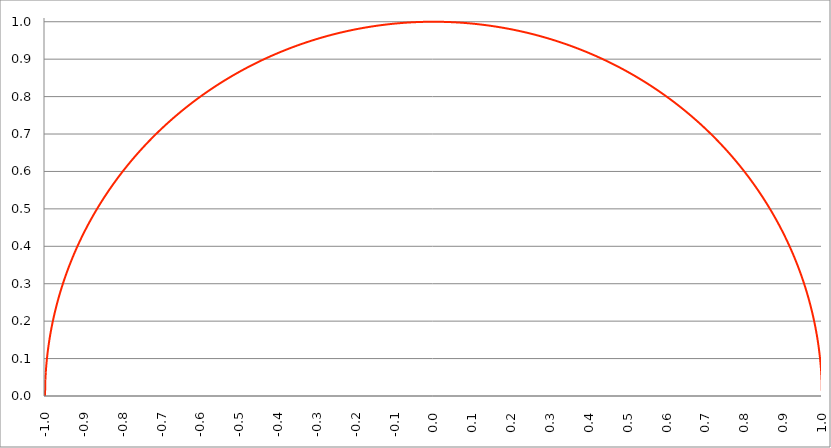
| Category | Series 1 |
|---|---|
| -1.0 | 0 |
| -0.999 | 0.045 |
| -0.998 | 0.063 |
| -0.997 | 0.077 |
| -0.996 | 0.089 |
| -0.995 | 0.1 |
| -0.994 | 0.109 |
| -0.993 | 0.118 |
| -0.992 | 0.126 |
| -0.991 | 0.134 |
| -0.99 | 0.141 |
| -0.989 | 0.148 |
| -0.988 | 0.154 |
| -0.987 | 0.161 |
| -0.986 | 0.167 |
| -0.985 | 0.173 |
| -0.984 | 0.178 |
| -0.983 | 0.184 |
| -0.982 | 0.189 |
| -0.981 | 0.194 |
| -0.98 | 0.199 |
| -0.979 | 0.204 |
| -0.978 | 0.209 |
| -0.977 | 0.213 |
| -0.976 | 0.218 |
| -0.975 | 0.222 |
| -0.974 | 0.227 |
| -0.973 | 0.231 |
| -0.972 | 0.235 |
| -0.971 | 0.239 |
| -0.97 | 0.243 |
| -0.969 | 0.247 |
| -0.968 | 0.251 |
| -0.967 | 0.255 |
| -0.966 | 0.259 |
| -0.965 | 0.262 |
| -0.964 | 0.266 |
| -0.963 | 0.27 |
| -0.962 | 0.273 |
| -0.961 | 0.277 |
| -0.96 | 0.28 |
| -0.959 | 0.283 |
| -0.958 | 0.287 |
| -0.957 | 0.29 |
| -0.956 | 0.293 |
| -0.955 | 0.297 |
| -0.954 | 0.3 |
| -0.953 | 0.303 |
| -0.952 | 0.306 |
| -0.951 | 0.309 |
| -0.95 | 0.312 |
| -0.949 | 0.315 |
| -0.948 | 0.318 |
| -0.947 | 0.321 |
| -0.946 | 0.324 |
| -0.945 | 0.327 |
| -0.944 | 0.33 |
| -0.943 | 0.333 |
| -0.942 | 0.336 |
| -0.941 | 0.338 |
| -0.94 | 0.341 |
| -0.939 | 0.344 |
| -0.938 | 0.347 |
| -0.937 | 0.349 |
| -0.936 | 0.352 |
| -0.935 | 0.355 |
| -0.934 | 0.357 |
| -0.933 | 0.36 |
| -0.932 | 0.362 |
| -0.931 | 0.365 |
| -0.93 | 0.368 |
| -0.929 | 0.37 |
| -0.928 | 0.373 |
| -0.927 | 0.375 |
| -0.926 | 0.378 |
| -0.925 | 0.38 |
| -0.924 | 0.382 |
| -0.923 | 0.385 |
| -0.922 | 0.387 |
| -0.921 | 0.39 |
| -0.92 | 0.392 |
| -0.919 | 0.394 |
| -0.918 | 0.397 |
| -0.917 | 0.399 |
| -0.916 | 0.401 |
| -0.915 | 0.403 |
| -0.914 | 0.406 |
| -0.913 | 0.408 |
| -0.912 | 0.41 |
| -0.911 | 0.412 |
| -0.91 | 0.415 |
| -0.909 | 0.417 |
| -0.908 | 0.419 |
| -0.907 | 0.421 |
| -0.906 | 0.423 |
| -0.905 | 0.425 |
| -0.904 | 0.428 |
| -0.903 | 0.43 |
| -0.902 | 0.432 |
| -0.901 | 0.434 |
| -0.9 | 0.436 |
| -0.899 | 0.438 |
| -0.898 | 0.44 |
| -0.897 | 0.442 |
| -0.896 | 0.444 |
| -0.895 | 0.446 |
| -0.894 | 0.448 |
| -0.893 | 0.45 |
| -0.892 | 0.452 |
| -0.891 | 0.454 |
| -0.89 | 0.456 |
| -0.889 | 0.458 |
| -0.888 | 0.46 |
| -0.887 | 0.462 |
| -0.886 | 0.464 |
| -0.885 | 0.466 |
| -0.884 | 0.467 |
| -0.883 | 0.469 |
| -0.882 | 0.471 |
| -0.881 | 0.473 |
| -0.88 | 0.475 |
| -0.879 | 0.477 |
| -0.878 | 0.479 |
| -0.877 | 0.48 |
| -0.876 | 0.482 |
| -0.875 | 0.484 |
| -0.874 | 0.486 |
| -0.873 | 0.488 |
| -0.872 | 0.49 |
| -0.871 | 0.491 |
| -0.87 | 0.493 |
| -0.869 | 0.495 |
| -0.868 | 0.497 |
| -0.867 | 0.498 |
| -0.866 | 0.5 |
| -0.865 | 0.502 |
| -0.864 | 0.503 |
| -0.863 | 0.505 |
| -0.862 | 0.507 |
| -0.861 | 0.509 |
| -0.86 | 0.51 |
| -0.859 | 0.512 |
| -0.858 | 0.514 |
| -0.857 | 0.515 |
| -0.856 | 0.517 |
| -0.855 | 0.519 |
| -0.854 | 0.52 |
| -0.853 | 0.522 |
| -0.852 | 0.524 |
| -0.851 | 0.525 |
| -0.85 | 0.527 |
| -0.849 | 0.528 |
| -0.848 | 0.53 |
| -0.847 | 0.532 |
| -0.846 | 0.533 |
| -0.845 | 0.535 |
| -0.844 | 0.536 |
| -0.843 | 0.538 |
| -0.842 | 0.539 |
| -0.841 | 0.541 |
| -0.84 | 0.543 |
| -0.839 | 0.544 |
| -0.838 | 0.546 |
| -0.837 | 0.547 |
| -0.836 | 0.549 |
| -0.835 | 0.55 |
| -0.834 | 0.552 |
| -0.833 | 0.553 |
| -0.832 | 0.555 |
| -0.831 | 0.556 |
| -0.83 | 0.558 |
| -0.829 | 0.559 |
| -0.828 | 0.561 |
| -0.827 | 0.562 |
| -0.826 | 0.564 |
| -0.825 | 0.565 |
| -0.824 | 0.567 |
| -0.823 | 0.568 |
| -0.822 | 0.569 |
| -0.821 | 0.571 |
| -0.82 | 0.572 |
| -0.819 | 0.574 |
| -0.818 | 0.575 |
| -0.817 | 0.577 |
| -0.816 | 0.578 |
| -0.815 | 0.579 |
| -0.814 | 0.581 |
| -0.813 | 0.582 |
| -0.812 | 0.584 |
| -0.811 | 0.585 |
| -0.81 | 0.586 |
| -0.809 | 0.588 |
| -0.808 | 0.589 |
| -0.807 | 0.591 |
| -0.806 | 0.592 |
| -0.805 | 0.593 |
| -0.804 | 0.595 |
| -0.803 | 0.596 |
| -0.802 | 0.597 |
| -0.801 | 0.599 |
| -0.8 | 0.6 |
| -0.799 | 0.601 |
| -0.798 | 0.603 |
| -0.797 | 0.604 |
| -0.796 | 0.605 |
| -0.795 | 0.607 |
| -0.794 | 0.608 |
| -0.793 | 0.609 |
| -0.792 | 0.611 |
| -0.791 | 0.612 |
| -0.79 | 0.613 |
| -0.789 | 0.614 |
| -0.788 | 0.616 |
| -0.787 | 0.617 |
| -0.786 | 0.618 |
| -0.785 | 0.619 |
| -0.784 | 0.621 |
| -0.783 | 0.622 |
| -0.782 | 0.623 |
| -0.781 | 0.625 |
| -0.78 | 0.626 |
| -0.779 | 0.627 |
| -0.778 | 0.628 |
| -0.777 | 0.63 |
| -0.776 | 0.631 |
| -0.775 | 0.632 |
| -0.774 | 0.633 |
| -0.773 | 0.634 |
| -0.772 | 0.636 |
| -0.771 | 0.637 |
| -0.77 | 0.638 |
| -0.769 | 0.639 |
| -0.768 | 0.64 |
| -0.767 | 0.642 |
| -0.766 | 0.643 |
| -0.765 | 0.644 |
| -0.764 | 0.645 |
| -0.763 | 0.646 |
| -0.762 | 0.648 |
| -0.761 | 0.649 |
| -0.76 | 0.65 |
| -0.759 | 0.651 |
| -0.758 | 0.652 |
| -0.757 | 0.653 |
| -0.756 | 0.655 |
| -0.755 | 0.656 |
| -0.754 | 0.657 |
| -0.753 | 0.658 |
| -0.752 | 0.659 |
| -0.751 | 0.66 |
| -0.75 | 0.661 |
| -0.749 | 0.663 |
| -0.748 | 0.664 |
| -0.747 | 0.665 |
| -0.746 | 0.666 |
| -0.745 | 0.667 |
| -0.744 | 0.668 |
| -0.743 | 0.669 |
| -0.742 | 0.67 |
| -0.741 | 0.672 |
| -0.74 | 0.673 |
| -0.739 | 0.674 |
| -0.738 | 0.675 |
| -0.737 | 0.676 |
| -0.736 | 0.677 |
| -0.735 | 0.678 |
| -0.734 | 0.679 |
| -0.733 | 0.68 |
| -0.732 | 0.681 |
| -0.731 | 0.682 |
| -0.73 | 0.683 |
| -0.729 | 0.685 |
| -0.728 | 0.686 |
| -0.727 | 0.687 |
| -0.726 | 0.688 |
| -0.725 | 0.689 |
| -0.724 | 0.69 |
| -0.723 | 0.691 |
| -0.722 | 0.692 |
| -0.721 | 0.693 |
| -0.72 | 0.694 |
| -0.719 | 0.695 |
| -0.718 | 0.696 |
| -0.717 | 0.697 |
| -0.716 | 0.698 |
| -0.715 | 0.699 |
| -0.714 | 0.7 |
| -0.713 | 0.701 |
| -0.712 | 0.702 |
| -0.711 | 0.703 |
| -0.71 | 0.704 |
| -0.709 | 0.705 |
| -0.708 | 0.706 |
| -0.707 | 0.707 |
| -0.706 | 0.708 |
| -0.705 | 0.709 |
| -0.704 | 0.71 |
| -0.703 | 0.711 |
| -0.702 | 0.712 |
| -0.701 | 0.713 |
| -0.7 | 0.714 |
| -0.699 | 0.715 |
| -0.698 | 0.716 |
| -0.697 | 0.717 |
| -0.696 | 0.718 |
| -0.695 | 0.719 |
| -0.694 | 0.72 |
| -0.693 | 0.721 |
| -0.692 | 0.722 |
| -0.691 | 0.723 |
| -0.69 | 0.724 |
| -0.689 | 0.725 |
| -0.688 | 0.726 |
| -0.687 | 0.727 |
| -0.686 | 0.728 |
| -0.685 | 0.729 |
| -0.684 | 0.729 |
| -0.683 | 0.73 |
| -0.682 | 0.731 |
| -0.681 | 0.732 |
| -0.68 | 0.733 |
| -0.679 | 0.734 |
| -0.678 | 0.735 |
| -0.677 | 0.736 |
| -0.676 | 0.737 |
| -0.675 | 0.738 |
| -0.674 | 0.739 |
| -0.673 | 0.74 |
| -0.672 | 0.741 |
| -0.671 | 0.741 |
| -0.67 | 0.742 |
| -0.669 | 0.743 |
| -0.668 | 0.744 |
| -0.667 | 0.745 |
| -0.666 | 0.746 |
| -0.665 | 0.747 |
| -0.664 | 0.748 |
| -0.663 | 0.749 |
| -0.662 | 0.75 |
| -0.661 | 0.75 |
| -0.66 | 0.751 |
| -0.659 | 0.752 |
| -0.658 | 0.753 |
| -0.657 | 0.754 |
| -0.656 | 0.755 |
| -0.655 | 0.756 |
| -0.654 | 0.756 |
| -0.653 | 0.757 |
| -0.652 | 0.758 |
| -0.651 | 0.759 |
| -0.65 | 0.76 |
| -0.649 | 0.761 |
| -0.648 | 0.762 |
| -0.647 | 0.762 |
| -0.646 | 0.763 |
| -0.645 | 0.764 |
| -0.644 | 0.765 |
| -0.643 | 0.766 |
| -0.642 | 0.767 |
| -0.641 | 0.768 |
| -0.64 | 0.768 |
| -0.639 | 0.769 |
| -0.638 | 0.77 |
| -0.637 | 0.771 |
| -0.636 | 0.772 |
| -0.635 | 0.773 |
| -0.634 | 0.773 |
| -0.633 | 0.774 |
| -0.632 | 0.775 |
| -0.631 | 0.776 |
| -0.63 | 0.777 |
| -0.629 | 0.777 |
| -0.628 | 0.778 |
| -0.627 | 0.779 |
| -0.626 | 0.78 |
| -0.625 | 0.781 |
| -0.624 | 0.781 |
| -0.623 | 0.782 |
| -0.622 | 0.783 |
| -0.621 | 0.784 |
| -0.62 | 0.785 |
| -0.619 | 0.785 |
| -0.618 | 0.786 |
| -0.617 | 0.787 |
| -0.616 | 0.788 |
| -0.615 | 0.789 |
| -0.614 | 0.789 |
| -0.613 | 0.79 |
| -0.612 | 0.791 |
| -0.611 | 0.792 |
| -0.61 | 0.792 |
| -0.609 | 0.793 |
| -0.608 | 0.794 |
| -0.607 | 0.795 |
| -0.606 | 0.795 |
| -0.605 | 0.796 |
| -0.604 | 0.797 |
| -0.603 | 0.798 |
| -0.602 | 0.798 |
| -0.601 | 0.799 |
| -0.6 | 0.8 |
| -0.599 | 0.801 |
| -0.598 | 0.801 |
| -0.597 | 0.802 |
| -0.596 | 0.803 |
| -0.595 | 0.804 |
| -0.594 | 0.804 |
| -0.593 | 0.805 |
| -0.592 | 0.806 |
| -0.591 | 0.807 |
| -0.59 | 0.807 |
| -0.589 | 0.808 |
| -0.588 | 0.809 |
| -0.587 | 0.81 |
| -0.586 | 0.81 |
| -0.585 | 0.811 |
| -0.584 | 0.812 |
| -0.583 | 0.812 |
| -0.582 | 0.813 |
| -0.581 | 0.814 |
| -0.58 | 0.815 |
| -0.579 | 0.815 |
| -0.578 | 0.816 |
| -0.577 | 0.817 |
| -0.576 | 0.817 |
| -0.575 | 0.818 |
| -0.574 | 0.819 |
| -0.573 | 0.82 |
| -0.572 | 0.82 |
| -0.571 | 0.821 |
| -0.57 | 0.822 |
| -0.569 | 0.822 |
| -0.568 | 0.823 |
| -0.567 | 0.824 |
| -0.566 | 0.824 |
| -0.565 | 0.825 |
| -0.564 | 0.826 |
| -0.563 | 0.826 |
| -0.562 | 0.827 |
| -0.561 | 0.828 |
| -0.56 | 0.828 |
| -0.559 | 0.829 |
| -0.558 | 0.83 |
| -0.557 | 0.831 |
| -0.556 | 0.831 |
| -0.555 | 0.832 |
| -0.554 | 0.833 |
| -0.553 | 0.833 |
| -0.552 | 0.834 |
| -0.551 | 0.835 |
| -0.55 | 0.835 |
| -0.549 | 0.836 |
| -0.548 | 0.836 |
| -0.547 | 0.837 |
| -0.546 | 0.838 |
| -0.545 | 0.838 |
| -0.544 | 0.839 |
| -0.543 | 0.84 |
| -0.542 | 0.84 |
| -0.541 | 0.841 |
| -0.54 | 0.842 |
| -0.539 | 0.842 |
| -0.538 | 0.843 |
| -0.537 | 0.844 |
| -0.536 | 0.844 |
| -0.535 | 0.845 |
| -0.534 | 0.845 |
| -0.533 | 0.846 |
| -0.532 | 0.847 |
| -0.531 | 0.847 |
| -0.53 | 0.848 |
| -0.529 | 0.849 |
| -0.528 | 0.849 |
| -0.527 | 0.85 |
| -0.526 | 0.85 |
| -0.525 | 0.851 |
| -0.524 | 0.852 |
| -0.523 | 0.852 |
| -0.522 | 0.853 |
| -0.521 | 0.854 |
| -0.52 | 0.854 |
| -0.519 | 0.855 |
| -0.518 | 0.855 |
| -0.517 | 0.856 |
| -0.516 | 0.857 |
| -0.515 | 0.857 |
| -0.514 | 0.858 |
| -0.513 | 0.858 |
| -0.512 | 0.859 |
| -0.511 | 0.86 |
| -0.51 | 0.86 |
| -0.509 | 0.861 |
| -0.508 | 0.861 |
| -0.507 | 0.862 |
| -0.506 | 0.863 |
| -0.505 | 0.863 |
| -0.504 | 0.864 |
| -0.503 | 0.864 |
| -0.502 | 0.865 |
| -0.501 | 0.865 |
| -0.5 | 0.866 |
| -0.499 | 0.867 |
| -0.498 | 0.867 |
| -0.497 | 0.868 |
| -0.496 | 0.868 |
| -0.495 | 0.869 |
| -0.494 | 0.869 |
| -0.493 | 0.87 |
| -0.492 | 0.871 |
| -0.491 | 0.871 |
| -0.49 | 0.872 |
| -0.489 | 0.872 |
| -0.488 | 0.873 |
| -0.487 | 0.873 |
| -0.486 | 0.874 |
| -0.485 | 0.875 |
| -0.484 | 0.875 |
| -0.483 | 0.876 |
| -0.482 | 0.876 |
| -0.481 | 0.877 |
| -0.48 | 0.877 |
| -0.479 | 0.878 |
| -0.478 | 0.878 |
| -0.477 | 0.879 |
| -0.476 | 0.879 |
| -0.475 | 0.88 |
| -0.474 | 0.881 |
| -0.473 | 0.881 |
| -0.472 | 0.882 |
| -0.471 | 0.882 |
| -0.469999999999999 | 0.883 |
| -0.468999999999999 | 0.883 |
| -0.467999999999999 | 0.884 |
| -0.466999999999999 | 0.884 |
| -0.465999999999999 | 0.885 |
| -0.464999999999999 | 0.885 |
| -0.463999999999999 | 0.886 |
| -0.462999999999999 | 0.886 |
| -0.461999999999999 | 0.887 |
| -0.460999999999999 | 0.887 |
| -0.459999999999999 | 0.888 |
| -0.458999999999999 | 0.888 |
| -0.457999999999999 | 0.889 |
| -0.456999999999999 | 0.889 |
| -0.455999999999999 | 0.89 |
| -0.454999999999999 | 0.89 |
| -0.453999999999999 | 0.891 |
| -0.452999999999999 | 0.892 |
| -0.451999999999999 | 0.892 |
| -0.450999999999999 | 0.893 |
| -0.449999999999999 | 0.893 |
| -0.448999999999999 | 0.894 |
| -0.447999999999999 | 0.894 |
| -0.446999999999999 | 0.895 |
| -0.445999999999999 | 0.895 |
| -0.444999999999999 | 0.896 |
| -0.443999999999999 | 0.896 |
| -0.442999999999999 | 0.897 |
| -0.441999999999999 | 0.897 |
| -0.440999999999999 | 0.898 |
| -0.439999999999999 | 0.898 |
| -0.438999999999999 | 0.898 |
| -0.437999999999999 | 0.899 |
| -0.436999999999999 | 0.899 |
| -0.435999999999999 | 0.9 |
| -0.434999999999999 | 0.9 |
| -0.433999999999999 | 0.901 |
| -0.432999999999999 | 0.901 |
| -0.431999999999999 | 0.902 |
| -0.430999999999999 | 0.902 |
| -0.429999999999999 | 0.903 |
| -0.428999999999999 | 0.903 |
| -0.427999999999999 | 0.904 |
| -0.426999999999999 | 0.904 |
| -0.425999999999999 | 0.905 |
| -0.424999999999999 | 0.905 |
| -0.423999999999999 | 0.906 |
| -0.422999999999999 | 0.906 |
| -0.421999999999999 | 0.907 |
| -0.420999999999999 | 0.907 |
| -0.419999999999999 | 0.908 |
| -0.418999999999999 | 0.908 |
| -0.417999999999999 | 0.908 |
| -0.416999999999999 | 0.909 |
| -0.415999999999999 | 0.909 |
| -0.414999999999999 | 0.91 |
| -0.413999999999999 | 0.91 |
| -0.412999999999999 | 0.911 |
| -0.411999999999999 | 0.911 |
| -0.410999999999999 | 0.912 |
| -0.409999999999999 | 0.912 |
| -0.408999999999999 | 0.913 |
| -0.407999999999999 | 0.913 |
| -0.406999999999999 | 0.913 |
| -0.405999999999999 | 0.914 |
| -0.404999999999999 | 0.914 |
| -0.403999999999999 | 0.915 |
| -0.402999999999999 | 0.915 |
| -0.401999999999999 | 0.916 |
| -0.400999999999999 | 0.916 |
| -0.399999999999999 | 0.917 |
| -0.398999999999999 | 0.917 |
| -0.397999999999999 | 0.917 |
| -0.396999999999999 | 0.918 |
| -0.395999999999999 | 0.918 |
| -0.394999999999999 | 0.919 |
| -0.393999999999999 | 0.919 |
| -0.392999999999999 | 0.92 |
| -0.391999999999999 | 0.92 |
| -0.390999999999999 | 0.92 |
| -0.389999999999999 | 0.921 |
| -0.388999999999999 | 0.921 |
| -0.387999999999999 | 0.922 |
| -0.386999999999999 | 0.922 |
| -0.385999999999999 | 0.922 |
| -0.384999999999999 | 0.923 |
| -0.383999999999999 | 0.923 |
| -0.382999999999999 | 0.924 |
| -0.381999999999999 | 0.924 |
| -0.380999999999999 | 0.925 |
| -0.379999999999999 | 0.925 |
| -0.378999999999999 | 0.925 |
| -0.377999999999999 | 0.926 |
| -0.376999999999999 | 0.926 |
| -0.375999999999999 | 0.927 |
| -0.374999999999999 | 0.927 |
| -0.373999999999999 | 0.927 |
| -0.372999999999999 | 0.928 |
| -0.371999999999999 | 0.928 |
| -0.370999999999999 | 0.929 |
| -0.369999999999999 | 0.929 |
| -0.368999999999999 | 0.929 |
| -0.367999999999999 | 0.93 |
| -0.366999999999999 | 0.93 |
| -0.365999999999999 | 0.931 |
| -0.364999999999999 | 0.931 |
| -0.363999999999999 | 0.931 |
| -0.362999999999999 | 0.932 |
| -0.361999999999999 | 0.932 |
| -0.360999999999999 | 0.933 |
| -0.359999999999999 | 0.933 |
| -0.358999999999999 | 0.933 |
| -0.357999999999999 | 0.934 |
| -0.356999999999999 | 0.934 |
| -0.355999999999999 | 0.934 |
| -0.354999999999999 | 0.935 |
| -0.353999999999999 | 0.935 |
| -0.352999999999999 | 0.936 |
| -0.351999999999999 | 0.936 |
| -0.350999999999999 | 0.936 |
| -0.349999999999999 | 0.937 |
| -0.348999999999999 | 0.937 |
| -0.347999999999999 | 0.937 |
| -0.346999999999999 | 0.938 |
| -0.345999999999999 | 0.938 |
| -0.344999999999999 | 0.939 |
| -0.343999999999999 | 0.939 |
| -0.342999999999999 | 0.939 |
| -0.341999999999999 | 0.94 |
| -0.340999999999999 | 0.94 |
| -0.339999999999999 | 0.94 |
| -0.338999999999999 | 0.941 |
| -0.337999999999999 | 0.941 |
| -0.336999999999999 | 0.942 |
| -0.335999999999999 | 0.942 |
| -0.334999999999999 | 0.942 |
| -0.333999999999999 | 0.943 |
| -0.332999999999999 | 0.943 |
| -0.331999999999999 | 0.943 |
| -0.330999999999999 | 0.944 |
| -0.329999999999999 | 0.944 |
| -0.328999999999999 | 0.944 |
| -0.327999999999999 | 0.945 |
| -0.326999999999999 | 0.945 |
| -0.325999999999999 | 0.945 |
| -0.324999999999999 | 0.946 |
| -0.323999999999999 | 0.946 |
| -0.322999999999999 | 0.946 |
| -0.321999999999999 | 0.947 |
| -0.320999999999999 | 0.947 |
| -0.319999999999999 | 0.947 |
| -0.318999999999999 | 0.948 |
| -0.317999999999999 | 0.948 |
| -0.316999999999999 | 0.948 |
| -0.315999999999999 | 0.949 |
| -0.314999999999999 | 0.949 |
| -0.313999999999999 | 0.949 |
| -0.312999999999999 | 0.95 |
| -0.311999999999999 | 0.95 |
| -0.310999999999999 | 0.95 |
| -0.309999999999999 | 0.951 |
| -0.308999999999999 | 0.951 |
| -0.307999999999999 | 0.951 |
| -0.306999999999999 | 0.952 |
| -0.305999999999999 | 0.952 |
| -0.304999999999999 | 0.952 |
| -0.303999999999999 | 0.953 |
| -0.302999999999999 | 0.953 |
| -0.301999999999999 | 0.953 |
| -0.300999999999999 | 0.954 |
| -0.299999999999999 | 0.954 |
| -0.298999999999999 | 0.954 |
| -0.297999999999999 | 0.955 |
| -0.296999999999999 | 0.955 |
| -0.295999999999999 | 0.955 |
| -0.294999999999999 | 0.955 |
| -0.293999999999999 | 0.956 |
| -0.292999999999999 | 0.956 |
| -0.291999999999999 | 0.956 |
| -0.290999999999999 | 0.957 |
| -0.289999999999999 | 0.957 |
| -0.288999999999999 | 0.957 |
| -0.287999999999999 | 0.958 |
| -0.286999999999999 | 0.958 |
| -0.285999999999999 | 0.958 |
| -0.284999999999999 | 0.959 |
| -0.283999999999999 | 0.959 |
| -0.282999999999999 | 0.959 |
| -0.281999999999999 | 0.959 |
| -0.280999999999999 | 0.96 |
| -0.279999999999999 | 0.96 |
| -0.278999999999999 | 0.96 |
| -0.277999999999999 | 0.961 |
| -0.276999999999999 | 0.961 |
| -0.275999999999999 | 0.961 |
| -0.274999999999999 | 0.961 |
| -0.273999999999999 | 0.962 |
| -0.272999999999999 | 0.962 |
| -0.271999999999999 | 0.962 |
| -0.270999999999999 | 0.963 |
| -0.269999999999999 | 0.963 |
| -0.268999999999999 | 0.963 |
| -0.267999999999999 | 0.963 |
| -0.266999999999999 | 0.964 |
| -0.265999999999999 | 0.964 |
| -0.264999999999999 | 0.964 |
| -0.263999999999999 | 0.965 |
| -0.262999999999999 | 0.965 |
| -0.261999999999999 | 0.965 |
| -0.260999999999999 | 0.965 |
| -0.259999999999999 | 0.966 |
| -0.258999999999999 | 0.966 |
| -0.257999999999999 | 0.966 |
| -0.256999999999999 | 0.966 |
| -0.255999999999999 | 0.967 |
| -0.254999999999999 | 0.967 |
| -0.253999999999999 | 0.967 |
| -0.252999999999999 | 0.967 |
| -0.251999999999999 | 0.968 |
| -0.250999999999999 | 0.968 |
| -0.249999999999999 | 0.968 |
| -0.248999999999999 | 0.969 |
| -0.247999999999999 | 0.969 |
| -0.246999999999999 | 0.969 |
| -0.245999999999999 | 0.969 |
| -0.244999999999999 | 0.97 |
| -0.243999999999999 | 0.97 |
| -0.242999999999999 | 0.97 |
| -0.241999999999999 | 0.97 |
| -0.240999999999999 | 0.971 |
| -0.239999999999999 | 0.971 |
| -0.238999999999999 | 0.971 |
| -0.237999999999999 | 0.971 |
| -0.236999999999999 | 0.972 |
| -0.235999999999999 | 0.972 |
| -0.234999999999999 | 0.972 |
| -0.233999999999999 | 0.972 |
| -0.232999999999999 | 0.972 |
| -0.231999999999999 | 0.973 |
| -0.230999999999999 | 0.973 |
| -0.229999999999999 | 0.973 |
| -0.228999999999999 | 0.973 |
| -0.227999999999999 | 0.974 |
| -0.226999999999999 | 0.974 |
| -0.225999999999999 | 0.974 |
| -0.224999999999999 | 0.974 |
| -0.223999999999999 | 0.975 |
| -0.222999999999999 | 0.975 |
| -0.221999999999999 | 0.975 |
| -0.220999999999999 | 0.975 |
| -0.219999999999999 | 0.975 |
| -0.218999999999999 | 0.976 |
| -0.217999999999999 | 0.976 |
| -0.216999999999999 | 0.976 |
| -0.215999999999999 | 0.976 |
| -0.214999999999999 | 0.977 |
| -0.213999999999999 | 0.977 |
| -0.212999999999999 | 0.977 |
| -0.211999999999999 | 0.977 |
| -0.210999999999999 | 0.977 |
| -0.209999999999999 | 0.978 |
| -0.208999999999999 | 0.978 |
| -0.207999999999999 | 0.978 |
| -0.206999999999999 | 0.978 |
| -0.205999999999999 | 0.979 |
| -0.204999999999999 | 0.979 |
| -0.203999999999999 | 0.979 |
| -0.202999999999999 | 0.979 |
| -0.201999999999999 | 0.979 |
| -0.200999999999999 | 0.98 |
| -0.199999999999999 | 0.98 |
| -0.198999999999999 | 0.98 |
| -0.197999999999999 | 0.98 |
| -0.196999999999999 | 0.98 |
| -0.195999999999999 | 0.981 |
| -0.194999999999999 | 0.981 |
| -0.193999999999999 | 0.981 |
| -0.192999999999999 | 0.981 |
| -0.191999999999999 | 0.981 |
| -0.190999999999999 | 0.982 |
| -0.189999999999999 | 0.982 |
| -0.188999999999999 | 0.982 |
| -0.187999999999999 | 0.982 |
| -0.186999999999999 | 0.982 |
| -0.185999999999999 | 0.983 |
| -0.184999999999999 | 0.983 |
| -0.183999999999999 | 0.983 |
| -0.182999999999999 | 0.983 |
| -0.181999999999999 | 0.983 |
| -0.180999999999999 | 0.983 |
| -0.179999999999999 | 0.984 |
| -0.178999999999999 | 0.984 |
| -0.177999999999999 | 0.984 |
| -0.176999999999999 | 0.984 |
| -0.175999999999999 | 0.984 |
| -0.174999999999999 | 0.985 |
| -0.173999999999999 | 0.985 |
| -0.172999999999999 | 0.985 |
| -0.171999999999999 | 0.985 |
| -0.170999999999999 | 0.985 |
| -0.169999999999999 | 0.985 |
| -0.168999999999999 | 0.986 |
| -0.167999999999999 | 0.986 |
| -0.166999999999999 | 0.986 |
| -0.165999999999999 | 0.986 |
| -0.164999999999999 | 0.986 |
| -0.163999999999999 | 0.986 |
| -0.162999999999999 | 0.987 |
| -0.161999999999999 | 0.987 |
| -0.160999999999999 | 0.987 |
| -0.159999999999999 | 0.987 |
| -0.158999999999999 | 0.987 |
| -0.157999999999999 | 0.987 |
| -0.156999999999999 | 0.988 |
| -0.155999999999999 | 0.988 |
| -0.154999999999999 | 0.988 |
| -0.153999999999999 | 0.988 |
| -0.152999999999999 | 0.988 |
| -0.151999999999999 | 0.988 |
| -0.150999999999999 | 0.989 |
| -0.149999999999999 | 0.989 |
| -0.148999999999999 | 0.989 |
| -0.147999999999999 | 0.989 |
| -0.146999999999999 | 0.989 |
| -0.145999999999999 | 0.989 |
| -0.144999999999999 | 0.989 |
| -0.143999999999999 | 0.99 |
| -0.142999999999999 | 0.99 |
| -0.141999999999999 | 0.99 |
| -0.140999999999999 | 0.99 |
| -0.139999999999999 | 0.99 |
| -0.138999999999999 | 0.99 |
| -0.137999999999999 | 0.99 |
| -0.136999999999999 | 0.991 |
| -0.135999999999999 | 0.991 |
| -0.134999999999999 | 0.991 |
| -0.133999999999999 | 0.991 |
| -0.132999999999999 | 0.991 |
| -0.131999999999999 | 0.991 |
| -0.130999999999999 | 0.991 |
| -0.129999999999999 | 0.992 |
| -0.128999999999999 | 0.992 |
| -0.127999999999999 | 0.992 |
| -0.126999999999999 | 0.992 |
| -0.125999999999999 | 0.992 |
| -0.124999999999999 | 0.992 |
| -0.123999999999999 | 0.992 |
| -0.122999999999999 | 0.992 |
| -0.121999999999999 | 0.993 |
| -0.120999999999999 | 0.993 |
| -0.119999999999999 | 0.993 |
| -0.118999999999999 | 0.993 |
| -0.117999999999999 | 0.993 |
| -0.116999999999999 | 0.993 |
| -0.115999999999999 | 0.993 |
| -0.114999999999999 | 0.993 |
| -0.113999999999999 | 0.993 |
| -0.112999999999999 | 0.994 |
| -0.111999999999999 | 0.994 |
| -0.110999999999999 | 0.994 |
| -0.109999999999999 | 0.994 |
| -0.108999999999999 | 0.994 |
| -0.107999999999999 | 0.994 |
| -0.106999999999999 | 0.994 |
| -0.105999999999999 | 0.994 |
| -0.104999999999999 | 0.994 |
| -0.103999999999999 | 0.995 |
| -0.102999999999999 | 0.995 |
| -0.101999999999999 | 0.995 |
| -0.100999999999999 | 0.995 |
| -0.0999999999999992 | 0.995 |
| -0.0989999999999992 | 0.995 |
| -0.0979999999999992 | 0.995 |
| -0.0969999999999992 | 0.995 |
| -0.0959999999999992 | 0.995 |
| -0.0949999999999992 | 0.995 |
| -0.0939999999999992 | 0.996 |
| -0.0929999999999992 | 0.996 |
| -0.0919999999999992 | 0.996 |
| -0.0909999999999992 | 0.996 |
| -0.0899999999999992 | 0.996 |
| -0.0889999999999992 | 0.996 |
| -0.0879999999999992 | 0.996 |
| -0.0869999999999992 | 0.996 |
| -0.0859999999999992 | 0.996 |
| -0.0849999999999992 | 0.996 |
| -0.0839999999999992 | 0.996 |
| -0.0829999999999992 | 0.997 |
| -0.0819999999999992 | 0.997 |
| -0.0809999999999992 | 0.997 |
| -0.0799999999999992 | 0.997 |
| -0.0789999999999992 | 0.997 |
| -0.0779999999999992 | 0.997 |
| -0.0769999999999992 | 0.997 |
| -0.0759999999999992 | 0.997 |
| -0.0749999999999992 | 0.997 |
| -0.0739999999999992 | 0.997 |
| -0.0729999999999992 | 0.997 |
| -0.0719999999999992 | 0.997 |
| -0.0709999999999992 | 0.997 |
| -0.0699999999999992 | 0.998 |
| -0.0689999999999992 | 0.998 |
| -0.0679999999999992 | 0.998 |
| -0.0669999999999992 | 0.998 |
| -0.0659999999999992 | 0.998 |
| -0.0649999999999992 | 0.998 |
| -0.0639999999999992 | 0.998 |
| -0.0629999999999992 | 0.998 |
| -0.0619999999999992 | 0.998 |
| -0.0609999999999992 | 0.998 |
| -0.0599999999999992 | 0.998 |
| -0.0589999999999992 | 0.998 |
| -0.0579999999999992 | 0.998 |
| -0.0569999999999992 | 0.998 |
| -0.0559999999999992 | 0.998 |
| -0.0549999999999991 | 0.998 |
| -0.0539999999999991 | 0.999 |
| -0.0529999999999991 | 0.999 |
| -0.0519999999999991 | 0.999 |
| -0.0509999999999991 | 0.999 |
| -0.0499999999999991 | 0.999 |
| -0.0489999999999991 | 0.999 |
| -0.0479999999999991 | 0.999 |
| -0.0469999999999991 | 0.999 |
| -0.0459999999999991 | 0.999 |
| -0.0449999999999991 | 0.999 |
| -0.0439999999999991 | 0.999 |
| -0.0429999999999991 | 0.999 |
| -0.0419999999999991 | 0.999 |
| -0.0409999999999991 | 0.999 |
| -0.0399999999999991 | 0.999 |
| -0.0389999999999991 | 0.999 |
| -0.0379999999999991 | 0.999 |
| -0.0369999999999991 | 0.999 |
| -0.0359999999999991 | 0.999 |
| -0.0349999999999991 | 0.999 |
| -0.0339999999999991 | 0.999 |
| -0.0329999999999991 | 0.999 |
| -0.0319999999999991 | 0.999 |
| -0.0309999999999991 | 1 |
| -0.0299999999999991 | 1 |
| -0.0289999999999991 | 1 |
| -0.0279999999999991 | 1 |
| -0.0269999999999991 | 1 |
| -0.0259999999999991 | 1 |
| -0.0249999999999991 | 1 |
| -0.0239999999999991 | 1 |
| -0.0229999999999991 | 1 |
| -0.0219999999999991 | 1 |
| -0.0209999999999991 | 1 |
| -0.0199999999999991 | 1 |
| -0.0189999999999991 | 1 |
| -0.0179999999999991 | 1 |
| -0.0169999999999991 | 1 |
| -0.0159999999999991 | 1 |
| -0.0149999999999991 | 1 |
| -0.0139999999999991 | 1 |
| -0.0129999999999991 | 1 |
| -0.0119999999999991 | 1 |
| -0.0109999999999991 | 1 |
| -0.00999999999999912 | 1 |
| -0.00899999999999912 | 1 |
| -0.00799999999999912 | 1 |
| -0.00699999999999912 | 1 |
| -0.00599999999999912 | 1 |
| -0.00499999999999912 | 1 |
| -0.00399999999999912 | 1 |
| -0.00299999999999912 | 1 |
| -0.00199999999999912 | 1 |
| -0.000999999999999118 | 1 |
| 8.81239525796218e-16 | 1 |
| 0.00100000000000088 | 1 |
| 0.00200000000000088 | 1 |
| 0.00300000000000088 | 1 |
| 0.00400000000000088 | 1 |
| 0.00500000000000088 | 1 |
| 0.00600000000000088 | 1 |
| 0.00700000000000088 | 1 |
| 0.00800000000000088 | 1 |
| 0.00900000000000088 | 1 |
| 0.0100000000000009 | 1 |
| 0.0110000000000009 | 1 |
| 0.0120000000000009 | 1 |
| 0.0130000000000009 | 1 |
| 0.0140000000000009 | 1 |
| 0.0150000000000009 | 1 |
| 0.0160000000000009 | 1 |
| 0.0170000000000009 | 1 |
| 0.0180000000000009 | 1 |
| 0.0190000000000009 | 1 |
| 0.0200000000000009 | 1 |
| 0.0210000000000009 | 1 |
| 0.0220000000000009 | 1 |
| 0.0230000000000009 | 1 |
| 0.0240000000000009 | 1 |
| 0.0250000000000009 | 1 |
| 0.0260000000000009 | 1 |
| 0.0270000000000009 | 1 |
| 0.0280000000000009 | 1 |
| 0.0290000000000009 | 1 |
| 0.0300000000000009 | 1 |
| 0.0310000000000009 | 1 |
| 0.0320000000000009 | 0.999 |
| 0.0330000000000009 | 0.999 |
| 0.0340000000000009 | 0.999 |
| 0.0350000000000009 | 0.999 |
| 0.0360000000000009 | 0.999 |
| 0.0370000000000009 | 0.999 |
| 0.0380000000000009 | 0.999 |
| 0.0390000000000009 | 0.999 |
| 0.0400000000000009 | 0.999 |
| 0.0410000000000009 | 0.999 |
| 0.0420000000000009 | 0.999 |
| 0.0430000000000009 | 0.999 |
| 0.0440000000000009 | 0.999 |
| 0.0450000000000009 | 0.999 |
| 0.0460000000000009 | 0.999 |
| 0.0470000000000009 | 0.999 |
| 0.0480000000000009 | 0.999 |
| 0.0490000000000009 | 0.999 |
| 0.0500000000000009 | 0.999 |
| 0.0510000000000009 | 0.999 |
| 0.0520000000000009 | 0.999 |
| 0.0530000000000009 | 0.999 |
| 0.0540000000000009 | 0.999 |
| 0.0550000000000009 | 0.998 |
| 0.0560000000000009 | 0.998 |
| 0.0570000000000009 | 0.998 |
| 0.0580000000000009 | 0.998 |
| 0.0590000000000009 | 0.998 |
| 0.0600000000000009 | 0.998 |
| 0.0610000000000009 | 0.998 |
| 0.0620000000000009 | 0.998 |
| 0.0630000000000009 | 0.998 |
| 0.0640000000000009 | 0.998 |
| 0.0650000000000009 | 0.998 |
| 0.0660000000000009 | 0.998 |
| 0.0670000000000009 | 0.998 |
| 0.0680000000000009 | 0.998 |
| 0.0690000000000009 | 0.998 |
| 0.0700000000000009 | 0.998 |
| 0.0710000000000009 | 0.997 |
| 0.0720000000000009 | 0.997 |
| 0.0730000000000009 | 0.997 |
| 0.0740000000000009 | 0.997 |
| 0.0750000000000009 | 0.997 |
| 0.0760000000000009 | 0.997 |
| 0.0770000000000009 | 0.997 |
| 0.0780000000000009 | 0.997 |
| 0.0790000000000009 | 0.997 |
| 0.0800000000000009 | 0.997 |
| 0.0810000000000009 | 0.997 |
| 0.0820000000000009 | 0.997 |
| 0.0830000000000009 | 0.997 |
| 0.0840000000000009 | 0.996 |
| 0.0850000000000009 | 0.996 |
| 0.0860000000000009 | 0.996 |
| 0.0870000000000009 | 0.996 |
| 0.0880000000000009 | 0.996 |
| 0.0890000000000009 | 0.996 |
| 0.0900000000000009 | 0.996 |
| 0.0910000000000009 | 0.996 |
| 0.0920000000000009 | 0.996 |
| 0.0930000000000009 | 0.996 |
| 0.0940000000000009 | 0.996 |
| 0.0950000000000009 | 0.995 |
| 0.0960000000000009 | 0.995 |
| 0.0970000000000009 | 0.995 |
| 0.0980000000000009 | 0.995 |
| 0.0990000000000009 | 0.995 |
| 0.100000000000001 | 0.995 |
| 0.101000000000001 | 0.995 |
| 0.102000000000001 | 0.995 |
| 0.103000000000001 | 0.995 |
| 0.104000000000001 | 0.995 |
| 0.105000000000001 | 0.994 |
| 0.106000000000001 | 0.994 |
| 0.107000000000001 | 0.994 |
| 0.108000000000001 | 0.994 |
| 0.109000000000001 | 0.994 |
| 0.110000000000001 | 0.994 |
| 0.111000000000001 | 0.994 |
| 0.112000000000001 | 0.994 |
| 0.113000000000001 | 0.994 |
| 0.114000000000001 | 0.993 |
| 0.115000000000001 | 0.993 |
| 0.116000000000001 | 0.993 |
| 0.117000000000001 | 0.993 |
| 0.118000000000001 | 0.993 |
| 0.119000000000001 | 0.993 |
| 0.120000000000001 | 0.993 |
| 0.121000000000001 | 0.993 |
| 0.122000000000001 | 0.993 |
| 0.123000000000001 | 0.992 |
| 0.124000000000001 | 0.992 |
| 0.125000000000001 | 0.992 |
| 0.126000000000001 | 0.992 |
| 0.127000000000001 | 0.992 |
| 0.128000000000001 | 0.992 |
| 0.129000000000001 | 0.992 |
| 0.130000000000001 | 0.992 |
| 0.131000000000001 | 0.991 |
| 0.132000000000001 | 0.991 |
| 0.133000000000001 | 0.991 |
| 0.134000000000001 | 0.991 |
| 0.135000000000001 | 0.991 |
| 0.136000000000001 | 0.991 |
| 0.137000000000001 | 0.991 |
| 0.138000000000001 | 0.99 |
| 0.139000000000001 | 0.99 |
| 0.140000000000001 | 0.99 |
| 0.141000000000001 | 0.99 |
| 0.142000000000001 | 0.99 |
| 0.143000000000001 | 0.99 |
| 0.144000000000001 | 0.99 |
| 0.145000000000001 | 0.989 |
| 0.146000000000001 | 0.989 |
| 0.147000000000001 | 0.989 |
| 0.148000000000001 | 0.989 |
| 0.149000000000001 | 0.989 |
| 0.150000000000001 | 0.989 |
| 0.151000000000001 | 0.989 |
| 0.152000000000001 | 0.988 |
| 0.153000000000001 | 0.988 |
| 0.154000000000001 | 0.988 |
| 0.155000000000001 | 0.988 |
| 0.156000000000001 | 0.988 |
| 0.157000000000001 | 0.988 |
| 0.158000000000001 | 0.987 |
| 0.159000000000001 | 0.987 |
| 0.160000000000001 | 0.987 |
| 0.161000000000001 | 0.987 |
| 0.162000000000001 | 0.987 |
| 0.163000000000001 | 0.987 |
| 0.164000000000001 | 0.986 |
| 0.165000000000001 | 0.986 |
| 0.166000000000001 | 0.986 |
| 0.167000000000001 | 0.986 |
| 0.168000000000001 | 0.986 |
| 0.169000000000001 | 0.986 |
| 0.170000000000001 | 0.985 |
| 0.171000000000001 | 0.985 |
| 0.172000000000001 | 0.985 |
| 0.173000000000001 | 0.985 |
| 0.174000000000001 | 0.985 |
| 0.175000000000001 | 0.985 |
| 0.176000000000001 | 0.984 |
| 0.177000000000001 | 0.984 |
| 0.178000000000001 | 0.984 |
| 0.179000000000001 | 0.984 |
| 0.180000000000001 | 0.984 |
| 0.181000000000001 | 0.983 |
| 0.182000000000001 | 0.983 |
| 0.183000000000001 | 0.983 |
| 0.184000000000001 | 0.983 |
| 0.185000000000001 | 0.983 |
| 0.186000000000001 | 0.983 |
| 0.187000000000001 | 0.982 |
| 0.188000000000001 | 0.982 |
| 0.189000000000001 | 0.982 |
| 0.190000000000001 | 0.982 |
| 0.191000000000001 | 0.982 |
| 0.192000000000001 | 0.981 |
| 0.193000000000001 | 0.981 |
| 0.194000000000001 | 0.981 |
| 0.195000000000001 | 0.981 |
| 0.196000000000001 | 0.981 |
| 0.197000000000001 | 0.98 |
| 0.198000000000001 | 0.98 |
| 0.199000000000001 | 0.98 |
| 0.200000000000001 | 0.98 |
| 0.201000000000001 | 0.98 |
| 0.202000000000001 | 0.979 |
| 0.203000000000001 | 0.979 |
| 0.204000000000001 | 0.979 |
| 0.205000000000001 | 0.979 |
| 0.206000000000001 | 0.979 |
| 0.207000000000001 | 0.978 |
| 0.208000000000001 | 0.978 |
| 0.209000000000001 | 0.978 |
| 0.210000000000001 | 0.978 |
| 0.211000000000001 | 0.977 |
| 0.212000000000001 | 0.977 |
| 0.213000000000001 | 0.977 |
| 0.214000000000001 | 0.977 |
| 0.215000000000001 | 0.977 |
| 0.216000000000001 | 0.976 |
| 0.217000000000001 | 0.976 |
| 0.218000000000001 | 0.976 |
| 0.219000000000001 | 0.976 |
| 0.220000000000001 | 0.975 |
| 0.221000000000001 | 0.975 |
| 0.222000000000001 | 0.975 |
| 0.223000000000001 | 0.975 |
| 0.224000000000001 | 0.975 |
| 0.225000000000001 | 0.974 |
| 0.226000000000001 | 0.974 |
| 0.227000000000001 | 0.974 |
| 0.228000000000001 | 0.974 |
| 0.229000000000001 | 0.973 |
| 0.230000000000001 | 0.973 |
| 0.231000000000001 | 0.973 |
| 0.232000000000001 | 0.973 |
| 0.233000000000001 | 0.972 |
| 0.234000000000001 | 0.972 |
| 0.235000000000001 | 0.972 |
| 0.236000000000001 | 0.972 |
| 0.237000000000001 | 0.972 |
| 0.238000000000001 | 0.971 |
| 0.239000000000001 | 0.971 |
| 0.240000000000001 | 0.971 |
| 0.241000000000001 | 0.971 |
| 0.242000000000001 | 0.97 |
| 0.243000000000001 | 0.97 |
| 0.244000000000001 | 0.97 |
| 0.245000000000001 | 0.97 |
| 0.246000000000001 | 0.969 |
| 0.247000000000001 | 0.969 |
| 0.248000000000001 | 0.969 |
| 0.249000000000001 | 0.969 |
| 0.250000000000001 | 0.968 |
| 0.251000000000001 | 0.968 |
| 0.252000000000001 | 0.968 |
| 0.253000000000001 | 0.967 |
| 0.254000000000001 | 0.967 |
| 0.255000000000001 | 0.967 |
| 0.256000000000001 | 0.967 |
| 0.257000000000001 | 0.966 |
| 0.258000000000001 | 0.966 |
| 0.259000000000001 | 0.966 |
| 0.260000000000001 | 0.966 |
| 0.261000000000001 | 0.965 |
| 0.262000000000001 | 0.965 |
| 0.263000000000001 | 0.965 |
| 0.264000000000001 | 0.965 |
| 0.265000000000001 | 0.964 |
| 0.266000000000001 | 0.964 |
| 0.267000000000001 | 0.964 |
| 0.268000000000001 | 0.963 |
| 0.269000000000001 | 0.963 |
| 0.270000000000001 | 0.963 |
| 0.271000000000001 | 0.963 |
| 0.272000000000001 | 0.962 |
| 0.273000000000001 | 0.962 |
| 0.274000000000001 | 0.962 |
| 0.275000000000001 | 0.961 |
| 0.276000000000001 | 0.961 |
| 0.277000000000001 | 0.961 |
| 0.278000000000001 | 0.961 |
| 0.279000000000001 | 0.96 |
| 0.280000000000001 | 0.96 |
| 0.281000000000001 | 0.96 |
| 0.282000000000001 | 0.959 |
| 0.283000000000001 | 0.959 |
| 0.284000000000001 | 0.959 |
| 0.285000000000001 | 0.959 |
| 0.286000000000001 | 0.958 |
| 0.287000000000001 | 0.958 |
| 0.288000000000001 | 0.958 |
| 0.289000000000001 | 0.957 |
| 0.290000000000001 | 0.957 |
| 0.291000000000001 | 0.957 |
| 0.292000000000001 | 0.956 |
| 0.293000000000001 | 0.956 |
| 0.294000000000001 | 0.956 |
| 0.295000000000001 | 0.955 |
| 0.296000000000001 | 0.955 |
| 0.297000000000001 | 0.955 |
| 0.298000000000001 | 0.955 |
| 0.299000000000001 | 0.954 |
| 0.300000000000001 | 0.954 |
| 0.301000000000001 | 0.954 |
| 0.302000000000001 | 0.953 |
| 0.303000000000001 | 0.953 |
| 0.304000000000001 | 0.953 |
| 0.305000000000001 | 0.952 |
| 0.306000000000001 | 0.952 |
| 0.307000000000001 | 0.952 |
| 0.308000000000001 | 0.951 |
| 0.309000000000001 | 0.951 |
| 0.310000000000001 | 0.951 |
| 0.311000000000001 | 0.95 |
| 0.312000000000001 | 0.95 |
| 0.313000000000001 | 0.95 |
| 0.314000000000001 | 0.949 |
| 0.315000000000001 | 0.949 |
| 0.316000000000001 | 0.949 |
| 0.317000000000001 | 0.948 |
| 0.318000000000001 | 0.948 |
| 0.319000000000001 | 0.948 |
| 0.320000000000001 | 0.947 |
| 0.321000000000001 | 0.947 |
| 0.322000000000001 | 0.947 |
| 0.323000000000001 | 0.946 |
| 0.324000000000001 | 0.946 |
| 0.325000000000001 | 0.946 |
| 0.326000000000001 | 0.945 |
| 0.327000000000001 | 0.945 |
| 0.328000000000001 | 0.945 |
| 0.329000000000001 | 0.944 |
| 0.330000000000001 | 0.944 |
| 0.331000000000001 | 0.944 |
| 0.332000000000001 | 0.943 |
| 0.333000000000001 | 0.943 |
| 0.334000000000001 | 0.943 |
| 0.335000000000001 | 0.942 |
| 0.336000000000001 | 0.942 |
| 0.337000000000001 | 0.942 |
| 0.338000000000001 | 0.941 |
| 0.339000000000001 | 0.941 |
| 0.340000000000001 | 0.94 |
| 0.341000000000001 | 0.94 |
| 0.342000000000001 | 0.94 |
| 0.343000000000001 | 0.939 |
| 0.344000000000001 | 0.939 |
| 0.345000000000001 | 0.939 |
| 0.346000000000001 | 0.938 |
| 0.347000000000001 | 0.938 |
| 0.348000000000001 | 0.937 |
| 0.349000000000001 | 0.937 |
| 0.350000000000001 | 0.937 |
| 0.351000000000001 | 0.936 |
| 0.352000000000001 | 0.936 |
| 0.353000000000001 | 0.936 |
| 0.354000000000001 | 0.935 |
| 0.355000000000001 | 0.935 |
| 0.356000000000001 | 0.934 |
| 0.357000000000001 | 0.934 |
| 0.358000000000001 | 0.934 |
| 0.359000000000001 | 0.933 |
| 0.360000000000001 | 0.933 |
| 0.361000000000001 | 0.933 |
| 0.362000000000001 | 0.932 |
| 0.363000000000001 | 0.932 |
| 0.364000000000001 | 0.931 |
| 0.365000000000001 | 0.931 |
| 0.366000000000001 | 0.931 |
| 0.367000000000001 | 0.93 |
| 0.368000000000001 | 0.93 |
| 0.369000000000001 | 0.929 |
| 0.370000000000001 | 0.929 |
| 0.371000000000001 | 0.929 |
| 0.372000000000001 | 0.928 |
| 0.373000000000001 | 0.928 |
| 0.374000000000001 | 0.927 |
| 0.375000000000001 | 0.927 |
| 0.376000000000001 | 0.927 |
| 0.377000000000001 | 0.926 |
| 0.378000000000001 | 0.926 |
| 0.379000000000001 | 0.925 |
| 0.380000000000001 | 0.925 |
| 0.381000000000001 | 0.925 |
| 0.382000000000001 | 0.924 |
| 0.383000000000001 | 0.924 |
| 0.384000000000001 | 0.923 |
| 0.385000000000001 | 0.923 |
| 0.386000000000001 | 0.922 |
| 0.387000000000001 | 0.922 |
| 0.388000000000001 | 0.922 |
| 0.389000000000001 | 0.921 |
| 0.390000000000001 | 0.921 |
| 0.391000000000001 | 0.92 |
| 0.392000000000001 | 0.92 |
| 0.393000000000001 | 0.92 |
| 0.394000000000001 | 0.919 |
| 0.395000000000001 | 0.919 |
| 0.396000000000001 | 0.918 |
| 0.397000000000001 | 0.918 |
| 0.398000000000001 | 0.917 |
| 0.399000000000001 | 0.917 |
| 0.400000000000001 | 0.917 |
| 0.401000000000001 | 0.916 |
| 0.402000000000001 | 0.916 |
| 0.403000000000001 | 0.915 |
| 0.404000000000001 | 0.915 |
| 0.405000000000001 | 0.914 |
| 0.406000000000001 | 0.914 |
| 0.407000000000001 | 0.913 |
| 0.408000000000001 | 0.913 |
| 0.409000000000001 | 0.913 |
| 0.410000000000001 | 0.912 |
| 0.411000000000001 | 0.912 |
| 0.412000000000001 | 0.911 |
| 0.413000000000001 | 0.911 |
| 0.414000000000001 | 0.91 |
| 0.415000000000001 | 0.91 |
| 0.416000000000001 | 0.909 |
| 0.417000000000001 | 0.909 |
| 0.418000000000001 | 0.908 |
| 0.419000000000001 | 0.908 |
| 0.420000000000001 | 0.908 |
| 0.421000000000001 | 0.907 |
| 0.422000000000001 | 0.907 |
| 0.423000000000001 | 0.906 |
| 0.424000000000001 | 0.906 |
| 0.425000000000001 | 0.905 |
| 0.426000000000001 | 0.905 |
| 0.427000000000001 | 0.904 |
| 0.428000000000001 | 0.904 |
| 0.429000000000001 | 0.903 |
| 0.430000000000001 | 0.903 |
| 0.431000000000001 | 0.902 |
| 0.432000000000001 | 0.902 |
| 0.433000000000001 | 0.901 |
| 0.434000000000001 | 0.901 |
| 0.435000000000001 | 0.9 |
| 0.436000000000001 | 0.9 |
| 0.437000000000001 | 0.899 |
| 0.438000000000001 | 0.899 |
| 0.439000000000001 | 0.898 |
| 0.440000000000001 | 0.898 |
| 0.441000000000001 | 0.898 |
| 0.442000000000001 | 0.897 |
| 0.443000000000001 | 0.897 |
| 0.444000000000001 | 0.896 |
| 0.445000000000001 | 0.896 |
| 0.446000000000001 | 0.895 |
| 0.447000000000001 | 0.895 |
| 0.448000000000001 | 0.894 |
| 0.449000000000001 | 0.894 |
| 0.450000000000001 | 0.893 |
| 0.451000000000001 | 0.893 |
| 0.452000000000001 | 0.892 |
| 0.453000000000001 | 0.892 |
| 0.454000000000001 | 0.891 |
| 0.455000000000001 | 0.89 |
| 0.456000000000001 | 0.89 |
| 0.457000000000001 | 0.889 |
| 0.458000000000001 | 0.889 |
| 0.459000000000001 | 0.888 |
| 0.460000000000001 | 0.888 |
| 0.461000000000001 | 0.887 |
| 0.462000000000001 | 0.887 |
| 0.463000000000001 | 0.886 |
| 0.464000000000001 | 0.886 |
| 0.465000000000001 | 0.885 |
| 0.466000000000001 | 0.885 |
| 0.467000000000001 | 0.884 |
| 0.468000000000001 | 0.884 |
| 0.469000000000001 | 0.883 |
| 0.470000000000001 | 0.883 |
| 0.471000000000001 | 0.882 |
| 0.472000000000001 | 0.882 |
| 0.473000000000001 | 0.881 |
| 0.474000000000001 | 0.881 |
| 0.475000000000001 | 0.88 |
| 0.476000000000001 | 0.879 |
| 0.477000000000001 | 0.879 |
| 0.478000000000001 | 0.878 |
| 0.479000000000001 | 0.878 |
| 0.480000000000001 | 0.877 |
| 0.481000000000001 | 0.877 |
| 0.482000000000001 | 0.876 |
| 0.483000000000001 | 0.876 |
| 0.484000000000001 | 0.875 |
| 0.485000000000001 | 0.875 |
| 0.486000000000001 | 0.874 |
| 0.487000000000001 | 0.873 |
| 0.488000000000001 | 0.873 |
| 0.489000000000001 | 0.872 |
| 0.490000000000001 | 0.872 |
| 0.491000000000001 | 0.871 |
| 0.492000000000001 | 0.871 |
| 0.493000000000001 | 0.87 |
| 0.494000000000001 | 0.869 |
| 0.495000000000001 | 0.869 |
| 0.496000000000001 | 0.868 |
| 0.497000000000001 | 0.868 |
| 0.498000000000001 | 0.867 |
| 0.499000000000001 | 0.867 |
| 0.500000000000001 | 0.866 |
| 0.501000000000001 | 0.865 |
| 0.502000000000001 | 0.865 |
| 0.503000000000001 | 0.864 |
| 0.504000000000001 | 0.864 |
| 0.505000000000001 | 0.863 |
| 0.506000000000001 | 0.863 |
| 0.507000000000001 | 0.862 |
| 0.508000000000001 | 0.861 |
| 0.509000000000001 | 0.861 |
| 0.510000000000001 | 0.86 |
| 0.511000000000001 | 0.86 |
| 0.512000000000001 | 0.859 |
| 0.513000000000001 | 0.858 |
| 0.514000000000001 | 0.858 |
| 0.515000000000001 | 0.857 |
| 0.516000000000001 | 0.857 |
| 0.517000000000001 | 0.856 |
| 0.518000000000001 | 0.855 |
| 0.519000000000001 | 0.855 |
| 0.520000000000001 | 0.854 |
| 0.521000000000001 | 0.854 |
| 0.522000000000001 | 0.853 |
| 0.523000000000001 | 0.852 |
| 0.524000000000001 | 0.852 |
| 0.525000000000001 | 0.851 |
| 0.526000000000001 | 0.85 |
| 0.527000000000001 | 0.85 |
| 0.528000000000001 | 0.849 |
| 0.529000000000001 | 0.849 |
| 0.530000000000001 | 0.848 |
| 0.531000000000001 | 0.847 |
| 0.532000000000001 | 0.847 |
| 0.533000000000001 | 0.846 |
| 0.534000000000001 | 0.845 |
| 0.535000000000001 | 0.845 |
| 0.536000000000001 | 0.844 |
| 0.537000000000001 | 0.844 |
| 0.538000000000001 | 0.843 |
| 0.539000000000001 | 0.842 |
| 0.540000000000001 | 0.842 |
| 0.541000000000001 | 0.841 |
| 0.542000000000001 | 0.84 |
| 0.543000000000001 | 0.84 |
| 0.544000000000001 | 0.839 |
| 0.545000000000001 | 0.838 |
| 0.546000000000001 | 0.838 |
| 0.547000000000001 | 0.837 |
| 0.548000000000001 | 0.836 |
| 0.549000000000001 | 0.836 |
| 0.550000000000001 | 0.835 |
| 0.551000000000001 | 0.835 |
| 0.552000000000001 | 0.834 |
| 0.553000000000001 | 0.833 |
| 0.554000000000001 | 0.833 |
| 0.555000000000001 | 0.832 |
| 0.556000000000001 | 0.831 |
| 0.557000000000001 | 0.831 |
| 0.558000000000001 | 0.83 |
| 0.559000000000001 | 0.829 |
| 0.560000000000001 | 0.828 |
| 0.561000000000001 | 0.828 |
| 0.562000000000001 | 0.827 |
| 0.563000000000001 | 0.826 |
| 0.564000000000001 | 0.826 |
| 0.565000000000001 | 0.825 |
| 0.566000000000001 | 0.824 |
| 0.567000000000001 | 0.824 |
| 0.568000000000001 | 0.823 |
| 0.569000000000001 | 0.822 |
| 0.570000000000001 | 0.822 |
| 0.571000000000001 | 0.821 |
| 0.572000000000001 | 0.82 |
| 0.573000000000001 | 0.82 |
| 0.574000000000001 | 0.819 |
| 0.575000000000001 | 0.818 |
| 0.576000000000001 | 0.817 |
| 0.577000000000001 | 0.817 |
| 0.578000000000001 | 0.816 |
| 0.579000000000001 | 0.815 |
| 0.580000000000001 | 0.815 |
| 0.581000000000001 | 0.814 |
| 0.582000000000001 | 0.813 |
| 0.583000000000001 | 0.812 |
| 0.584000000000001 | 0.812 |
| 0.585000000000001 | 0.811 |
| 0.586000000000001 | 0.81 |
| 0.587000000000001 | 0.81 |
| 0.588000000000001 | 0.809 |
| 0.589000000000001 | 0.808 |
| 0.590000000000001 | 0.807 |
| 0.591000000000001 | 0.807 |
| 0.592000000000001 | 0.806 |
| 0.593000000000001 | 0.805 |
| 0.594000000000001 | 0.804 |
| 0.595000000000001 | 0.804 |
| 0.596000000000001 | 0.803 |
| 0.597000000000001 | 0.802 |
| 0.598000000000001 | 0.801 |
| 0.599000000000001 | 0.801 |
| 0.600000000000001 | 0.8 |
| 0.601000000000001 | 0.799 |
| 0.602000000000001 | 0.798 |
| 0.603000000000001 | 0.798 |
| 0.604000000000001 | 0.797 |
| 0.605000000000001 | 0.796 |
| 0.606000000000001 | 0.795 |
| 0.607000000000001 | 0.795 |
| 0.608000000000001 | 0.794 |
| 0.609000000000001 | 0.793 |
| 0.610000000000001 | 0.792 |
| 0.611000000000001 | 0.792 |
| 0.612000000000001 | 0.791 |
| 0.613000000000001 | 0.79 |
| 0.614000000000001 | 0.789 |
| 0.615000000000001 | 0.789 |
| 0.616000000000001 | 0.788 |
| 0.617000000000001 | 0.787 |
| 0.618000000000001 | 0.786 |
| 0.619000000000001 | 0.785 |
| 0.620000000000001 | 0.785 |
| 0.621000000000001 | 0.784 |
| 0.622000000000001 | 0.783 |
| 0.623000000000001 | 0.782 |
| 0.624000000000001 | 0.781 |
| 0.625000000000001 | 0.781 |
| 0.626000000000001 | 0.78 |
| 0.627000000000001 | 0.779 |
| 0.628000000000001 | 0.778 |
| 0.629000000000001 | 0.777 |
| 0.630000000000001 | 0.777 |
| 0.631000000000001 | 0.776 |
| 0.632000000000001 | 0.775 |
| 0.633000000000001 | 0.774 |
| 0.634000000000001 | 0.773 |
| 0.635000000000001 | 0.773 |
| 0.636000000000001 | 0.772 |
| 0.637000000000001 | 0.771 |
| 0.638000000000001 | 0.77 |
| 0.639000000000001 | 0.769 |
| 0.640000000000001 | 0.768 |
| 0.641000000000001 | 0.768 |
| 0.642000000000001 | 0.767 |
| 0.643000000000001 | 0.766 |
| 0.644000000000001 | 0.765 |
| 0.645000000000001 | 0.764 |
| 0.646000000000001 | 0.763 |
| 0.647000000000001 | 0.762 |
| 0.648000000000001 | 0.762 |
| 0.649000000000001 | 0.761 |
| 0.650000000000001 | 0.76 |
| 0.651000000000001 | 0.759 |
| 0.652000000000001 | 0.758 |
| 0.653000000000001 | 0.757 |
| 0.654000000000001 | 0.756 |
| 0.655000000000001 | 0.756 |
| 0.656000000000001 | 0.755 |
| 0.657000000000001 | 0.754 |
| 0.658000000000001 | 0.753 |
| 0.659000000000001 | 0.752 |
| 0.660000000000001 | 0.751 |
| 0.661000000000001 | 0.75 |
| 0.662000000000001 | 0.75 |
| 0.663000000000001 | 0.749 |
| 0.664000000000001 | 0.748 |
| 0.665000000000001 | 0.747 |
| 0.666000000000001 | 0.746 |
| 0.667000000000001 | 0.745 |
| 0.668000000000001 | 0.744 |
| 0.669000000000001 | 0.743 |
| 0.670000000000001 | 0.742 |
| 0.671000000000001 | 0.741 |
| 0.672000000000001 | 0.741 |
| 0.673000000000001 | 0.74 |
| 0.674000000000001 | 0.739 |
| 0.675000000000001 | 0.738 |
| 0.676000000000001 | 0.737 |
| 0.677000000000001 | 0.736 |
| 0.678000000000001 | 0.735 |
| 0.679000000000001 | 0.734 |
| 0.680000000000001 | 0.733 |
| 0.681000000000001 | 0.732 |
| 0.682000000000001 | 0.731 |
| 0.683000000000001 | 0.73 |
| 0.684000000000001 | 0.729 |
| 0.685000000000001 | 0.729 |
| 0.686000000000001 | 0.728 |
| 0.687000000000001 | 0.727 |
| 0.688000000000001 | 0.726 |
| 0.689000000000001 | 0.725 |
| 0.690000000000001 | 0.724 |
| 0.691000000000001 | 0.723 |
| 0.692000000000001 | 0.722 |
| 0.693000000000001 | 0.721 |
| 0.694000000000001 | 0.72 |
| 0.695000000000001 | 0.719 |
| 0.696000000000001 | 0.718 |
| 0.697000000000001 | 0.717 |
| 0.698000000000001 | 0.716 |
| 0.699000000000001 | 0.715 |
| 0.700000000000001 | 0.714 |
| 0.701000000000001 | 0.713 |
| 0.702000000000001 | 0.712 |
| 0.703000000000001 | 0.711 |
| 0.704000000000001 | 0.71 |
| 0.705000000000001 | 0.709 |
| 0.706000000000001 | 0.708 |
| 0.707000000000001 | 0.707 |
| 0.708000000000001 | 0.706 |
| 0.709000000000001 | 0.705 |
| 0.710000000000001 | 0.704 |
| 0.711000000000001 | 0.703 |
| 0.712000000000001 | 0.702 |
| 0.713000000000001 | 0.701 |
| 0.714000000000001 | 0.7 |
| 0.715000000000001 | 0.699 |
| 0.716000000000001 | 0.698 |
| 0.717000000000001 | 0.697 |
| 0.718000000000001 | 0.696 |
| 0.719000000000001 | 0.695 |
| 0.720000000000001 | 0.694 |
| 0.721000000000001 | 0.693 |
| 0.722000000000001 | 0.692 |
| 0.723000000000001 | 0.691 |
| 0.724000000000001 | 0.69 |
| 0.725000000000001 | 0.689 |
| 0.726000000000001 | 0.688 |
| 0.727000000000001 | 0.687 |
| 0.728000000000001 | 0.686 |
| 0.729000000000001 | 0.685 |
| 0.730000000000001 | 0.683 |
| 0.731000000000001 | 0.682 |
| 0.732000000000001 | 0.681 |
| 0.733000000000001 | 0.68 |
| 0.734000000000001 | 0.679 |
| 0.735000000000001 | 0.678 |
| 0.736000000000001 | 0.677 |
| 0.737000000000001 | 0.676 |
| 0.738000000000001 | 0.675 |
| 0.739000000000001 | 0.674 |
| 0.740000000000001 | 0.673 |
| 0.741000000000001 | 0.672 |
| 0.742000000000001 | 0.67 |
| 0.743000000000001 | 0.669 |
| 0.744000000000001 | 0.668 |
| 0.745000000000001 | 0.667 |
| 0.746000000000001 | 0.666 |
| 0.747000000000001 | 0.665 |
| 0.748000000000001 | 0.664 |
| 0.749000000000001 | 0.663 |
| 0.750000000000001 | 0.661 |
| 0.751000000000001 | 0.66 |
| 0.752000000000001 | 0.659 |
| 0.753000000000001 | 0.658 |
| 0.754000000000001 | 0.657 |
| 0.755000000000001 | 0.656 |
| 0.756000000000001 | 0.655 |
| 0.757000000000001 | 0.653 |
| 0.758000000000001 | 0.652 |
| 0.759000000000001 | 0.651 |
| 0.760000000000001 | 0.65 |
| 0.761000000000001 | 0.649 |
| 0.762000000000001 | 0.648 |
| 0.763000000000001 | 0.646 |
| 0.764000000000001 | 0.645 |
| 0.765000000000001 | 0.644 |
| 0.766000000000001 | 0.643 |
| 0.767000000000001 | 0.642 |
| 0.768000000000001 | 0.64 |
| 0.769000000000001 | 0.639 |
| 0.770000000000001 | 0.638 |
| 0.771000000000001 | 0.637 |
| 0.772000000000001 | 0.636 |
| 0.773000000000001 | 0.634 |
| 0.774000000000001 | 0.633 |
| 0.775000000000001 | 0.632 |
| 0.776000000000001 | 0.631 |
| 0.777000000000001 | 0.63 |
| 0.778000000000001 | 0.628 |
| 0.779000000000001 | 0.627 |
| 0.780000000000001 | 0.626 |
| 0.781000000000001 | 0.625 |
| 0.782000000000001 | 0.623 |
| 0.783000000000001 | 0.622 |
| 0.784000000000001 | 0.621 |
| 0.785000000000001 | 0.619 |
| 0.786000000000001 | 0.618 |
| 0.787000000000001 | 0.617 |
| 0.788000000000001 | 0.616 |
| 0.789000000000001 | 0.614 |
| 0.790000000000001 | 0.613 |
| 0.791000000000001 | 0.612 |
| 0.792000000000001 | 0.611 |
| 0.793000000000001 | 0.609 |
| 0.794000000000001 | 0.608 |
| 0.795000000000001 | 0.607 |
| 0.796000000000001 | 0.605 |
| 0.797000000000001 | 0.604 |
| 0.798000000000001 | 0.603 |
| 0.799000000000001 | 0.601 |
| 0.800000000000001 | 0.6 |
| 0.801000000000001 | 0.599 |
| 0.802000000000001 | 0.597 |
| 0.803000000000001 | 0.596 |
| 0.804000000000001 | 0.595 |
| 0.805000000000001 | 0.593 |
| 0.806000000000001 | 0.592 |
| 0.807000000000001 | 0.591 |
| 0.808000000000001 | 0.589 |
| 0.809000000000001 | 0.588 |
| 0.810000000000001 | 0.586 |
| 0.811000000000001 | 0.585 |
| 0.812000000000001 | 0.584 |
| 0.813000000000001 | 0.582 |
| 0.814000000000001 | 0.581 |
| 0.815000000000001 | 0.579 |
| 0.816000000000001 | 0.578 |
| 0.817000000000001 | 0.577 |
| 0.818000000000001 | 0.575 |
| 0.819000000000001 | 0.574 |
| 0.820000000000001 | 0.572 |
| 0.821000000000001 | 0.571 |
| 0.822000000000001 | 0.569 |
| 0.823000000000001 | 0.568 |
| 0.824000000000001 | 0.567 |
| 0.825000000000001 | 0.565 |
| 0.826000000000001 | 0.564 |
| 0.827000000000001 | 0.562 |
| 0.828000000000001 | 0.561 |
| 0.829000000000001 | 0.559 |
| 0.830000000000001 | 0.558 |
| 0.831000000000001 | 0.556 |
| 0.832000000000001 | 0.555 |
| 0.833000000000001 | 0.553 |
| 0.834000000000001 | 0.552 |
| 0.835000000000001 | 0.55 |
| 0.836000000000001 | 0.549 |
| 0.837000000000001 | 0.547 |
| 0.838000000000001 | 0.546 |
| 0.839000000000001 | 0.544 |
| 0.840000000000001 | 0.543 |
| 0.841000000000001 | 0.541 |
| 0.842000000000001 | 0.539 |
| 0.843000000000001 | 0.538 |
| 0.844000000000001 | 0.536 |
| 0.845000000000001 | 0.535 |
| 0.846000000000001 | 0.533 |
| 0.847000000000001 | 0.532 |
| 0.848000000000001 | 0.53 |
| 0.849000000000001 | 0.528 |
| 0.850000000000001 | 0.527 |
| 0.851000000000001 | 0.525 |
| 0.852000000000001 | 0.524 |
| 0.853000000000001 | 0.522 |
| 0.854000000000001 | 0.52 |
| 0.855000000000001 | 0.519 |
| 0.856000000000001 | 0.517 |
| 0.857000000000001 | 0.515 |
| 0.858000000000001 | 0.514 |
| 0.859000000000001 | 0.512 |
| 0.860000000000001 | 0.51 |
| 0.861000000000001 | 0.509 |
| 0.862000000000001 | 0.507 |
| 0.863000000000001 | 0.505 |
| 0.864000000000001 | 0.503 |
| 0.865000000000001 | 0.502 |
| 0.866000000000001 | 0.5 |
| 0.867000000000001 | 0.498 |
| 0.868000000000001 | 0.497 |
| 0.869000000000001 | 0.495 |
| 0.870000000000001 | 0.493 |
| 0.871000000000001 | 0.491 |
| 0.872000000000002 | 0.49 |
| 0.873000000000002 | 0.488 |
| 0.874000000000002 | 0.486 |
| 0.875000000000002 | 0.484 |
| 0.876000000000002 | 0.482 |
| 0.877000000000002 | 0.48 |
| 0.878000000000002 | 0.479 |
| 0.879000000000002 | 0.477 |
| 0.880000000000001 | 0.475 |
| 0.881000000000001 | 0.473 |
| 0.882000000000002 | 0.471 |
| 0.883000000000002 | 0.469 |
| 0.884000000000002 | 0.467 |
| 0.885000000000002 | 0.466 |
| 0.886000000000002 | 0.464 |
| 0.887000000000002 | 0.462 |
| 0.888000000000002 | 0.46 |
| 0.889000000000002 | 0.458 |
| 0.890000000000001 | 0.456 |
| 0.891000000000001 | 0.454 |
| 0.892000000000002 | 0.452 |
| 0.893000000000002 | 0.45 |
| 0.894000000000002 | 0.448 |
| 0.895000000000002 | 0.446 |
| 0.896000000000002 | 0.444 |
| 0.897000000000002 | 0.442 |
| 0.898000000000002 | 0.44 |
| 0.899000000000002 | 0.438 |
| 0.900000000000002 | 0.436 |
| 0.901000000000002 | 0.434 |
| 0.902000000000002 | 0.432 |
| 0.903000000000002 | 0.43 |
| 0.904000000000002 | 0.428 |
| 0.905000000000002 | 0.425 |
| 0.906000000000002 | 0.423 |
| 0.907000000000002 | 0.421 |
| 0.908000000000002 | 0.419 |
| 0.909000000000002 | 0.417 |
| 0.910000000000002 | 0.415 |
| 0.911000000000002 | 0.412 |
| 0.912000000000002 | 0.41 |
| 0.913000000000002 | 0.408 |
| 0.914000000000002 | 0.406 |
| 0.915000000000002 | 0.403 |
| 0.916000000000002 | 0.401 |
| 0.917000000000002 | 0.399 |
| 0.918000000000002 | 0.397 |
| 0.919000000000002 | 0.394 |
| 0.920000000000002 | 0.392 |
| 0.921000000000002 | 0.39 |
| 0.922000000000002 | 0.387 |
| 0.923000000000002 | 0.385 |
| 0.924000000000002 | 0.382 |
| 0.925000000000002 | 0.38 |
| 0.926000000000002 | 0.378 |
| 0.927000000000002 | 0.375 |
| 0.928000000000002 | 0.373 |
| 0.929000000000002 | 0.37 |
| 0.930000000000002 | 0.368 |
| 0.931000000000002 | 0.365 |
| 0.932000000000002 | 0.362 |
| 0.933000000000002 | 0.36 |
| 0.934000000000002 | 0.357 |
| 0.935000000000002 | 0.355 |
| 0.936000000000002 | 0.352 |
| 0.937000000000002 | 0.349 |
| 0.938000000000002 | 0.347 |
| 0.939000000000002 | 0.344 |
| 0.940000000000002 | 0.341 |
| 0.941000000000002 | 0.338 |
| 0.942000000000002 | 0.336 |
| 0.943000000000002 | 0.333 |
| 0.944000000000002 | 0.33 |
| 0.945000000000002 | 0.327 |
| 0.946000000000002 | 0.324 |
| 0.947000000000002 | 0.321 |
| 0.948000000000002 | 0.318 |
| 0.949000000000002 | 0.315 |
| 0.950000000000002 | 0.312 |
| 0.951000000000002 | 0.309 |
| 0.952000000000002 | 0.306 |
| 0.953000000000002 | 0.303 |
| 0.954000000000002 | 0.3 |
| 0.955000000000002 | 0.297 |
| 0.956000000000002 | 0.293 |
| 0.957000000000002 | 0.29 |
| 0.958000000000002 | 0.287 |
| 0.959000000000002 | 0.283 |
| 0.960000000000002 | 0.28 |
| 0.961000000000002 | 0.277 |
| 0.962000000000002 | 0.273 |
| 0.963000000000002 | 0.27 |
| 0.964000000000002 | 0.266 |
| 0.965000000000002 | 0.262 |
| 0.966000000000002 | 0.259 |
| 0.967000000000002 | 0.255 |
| 0.968000000000002 | 0.251 |
| 0.969000000000002 | 0.247 |
| 0.970000000000002 | 0.243 |
| 0.971000000000002 | 0.239 |
| 0.972000000000002 | 0.235 |
| 0.973000000000002 | 0.231 |
| 0.974000000000002 | 0.227 |
| 0.975000000000002 | 0.222 |
| 0.976000000000002 | 0.218 |
| 0.977000000000002 | 0.213 |
| 0.978000000000002 | 0.209 |
| 0.979000000000002 | 0.204 |
| 0.980000000000002 | 0.199 |
| 0.981000000000002 | 0.194 |
| 0.982000000000002 | 0.189 |
| 0.983000000000002 | 0.184 |
| 0.984000000000002 | 0.178 |
| 0.985000000000002 | 0.173 |
| 0.986000000000002 | 0.167 |
| 0.987000000000002 | 0.161 |
| 0.988000000000002 | 0.154 |
| 0.989000000000002 | 0.148 |
| 0.990000000000002 | 0.141 |
| 0.991000000000002 | 0.134 |
| 0.992000000000002 | 0.126 |
| 0.993000000000002 | 0.118 |
| 0.994000000000002 | 0.109 |
| 0.995000000000002 | 0.1 |
| 0.996000000000002 | 0.089 |
| 0.997000000000002 | 0.077 |
| 0.998000000000002 | 0.063 |
| 0.999000000000002 | 0.045 |
| 1.000000000000002 | 0 |